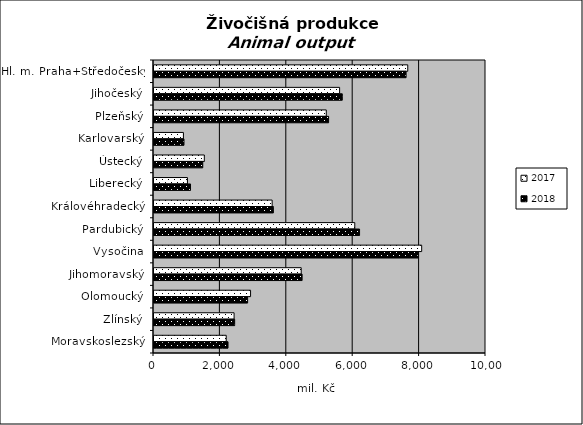
| Category | 2017 | 2018 |
|---|---|---|
| Hl. m. Praha+Středočeský | 7643.5 | 7592.754 |
| Jihočeský | 5590.73 | 5670.896 |
| Plzeňský | 5189.132 | 5258.873 |
| Karlovarský | 885.887 | 902.762 |
| Ústecký | 1515.897 | 1468.67 |
| Liberecký | 1007.346 | 1100.319 |
| Královéhradecký | 3558.691 | 3595.497 |
| Pardubický | 6047.276 | 6191.888 |
| Vysočina | 8062.45 | 7956.964 |
| Jihomoravský | 4433.83 | 4460.968 |
| Olomoucký | 2908.601 | 2819.682 |
| Zlínský | 2412.315 | 2429.809 |
| Moravskoslezský | 2175.703 | 2229.175 |